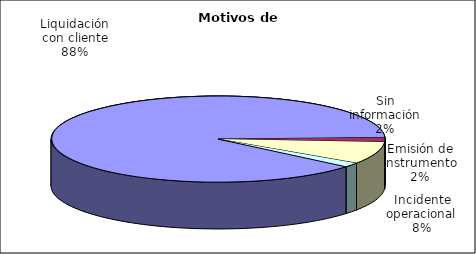
| Category | Motivos |
|---|---|
| Liquidación con cliente | 475 |
| Emisión de instrumento | 9 |
| Incidente operacional | 45 |
| Sin información | 9 |